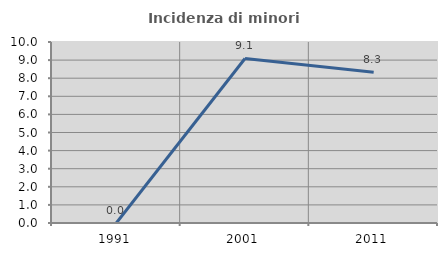
| Category | Incidenza di minori stranieri |
|---|---|
| 1991.0 | 0 |
| 2001.0 | 9.091 |
| 2011.0 | 8.333 |